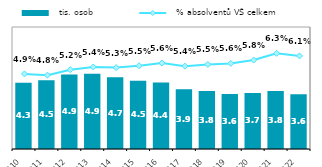
| Category |   tis. osob |
|---|---|
| 2010 | 4.337 |
| 2011 | 4.507 |
| 2012 | 4.893 |
| 2013 | 4.934 |
| 2014 | 4.711 |
| 2015 | 4.479 |
| 2016 | 4.361 |
| 2017 | 3.916 |
| 2018 | 3.802 |
| 2019 | 3.606 |
| 2020 | 3.673 |
| 2021 | 3.801 |
| 2022 | 3.584 |